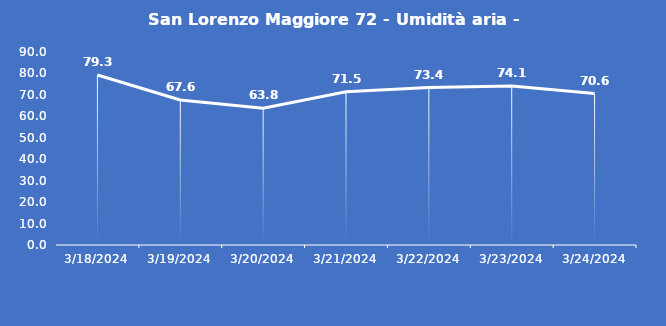
| Category | San Lorenzo Maggiore 72 - Umidità aria - Grezzo (%) |
|---|---|
| 3/18/24 | 79.3 |
| 3/19/24 | 67.6 |
| 3/20/24 | 63.8 |
| 3/21/24 | 71.5 |
| 3/22/24 | 73.4 |
| 3/23/24 | 74.1 |
| 3/24/24 | 70.6 |